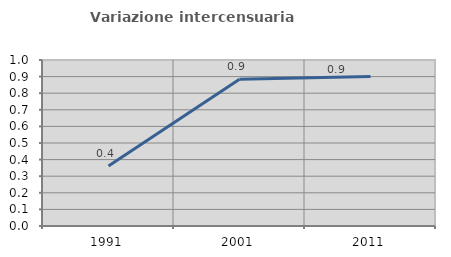
| Category | Variazione intercensuaria annua |
|---|---|
| 1991.0 | 0.361 |
| 2001.0 | 0.884 |
| 2011.0 | 0.901 |